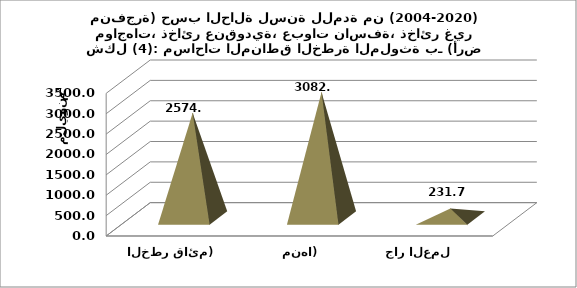
| Category | Series 0 |
|---|---|
| مفتوح (لازال الخطر قائم) | 2574.733 |
| مغلق (رفع الخطر منها) | 3082.802 |
|  جار العمل      | 231.697 |